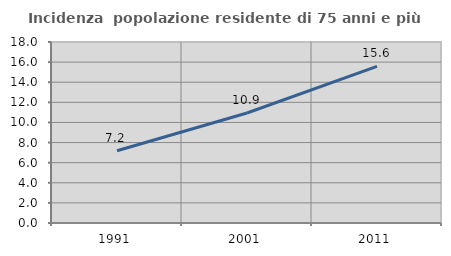
| Category | Incidenza  popolazione residente di 75 anni e più |
|---|---|
| 1991.0 | 7.18 |
| 2001.0 | 10.942 |
| 2011.0 | 15.581 |